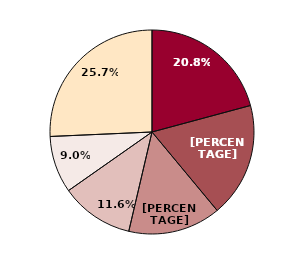
| Category | Series 0 |
|---|---|
| 336--Transportation Equipment | 2431.97 |
| 311--Processed Foods | 2121.309 |
| 111--Agricultural Products | 1716.102 |
| 333--Machinery, Except Electrical | 1355.513 |
| 325--Chemicals | 1055.899 |
| All others | 3003.145 |